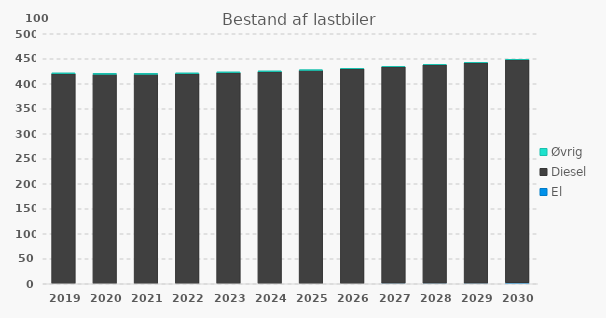
| Category | El | Diesel | Øvrig |
|---|---|---|---|
| 2019 | 0 | 420 | 2 |
| 2020 | 0 | 419 | 2 |
| 2021 | 0 | 419 | 2 |
| 2022 | 0 | 420 | 2 |
| 2023 | 0 | 422 | 2 |
| 2024 | 0 | 424 | 2 |
| 2025 | 0 | 427 | 1 |
| 2026 | 0 | 430 | 1 |
| 2027 | 1 | 433 | 1 |
| 2028 | 1 | 437 | 1 |
| 2029 | 1 | 441 | 1 |
| 2030 | 2 | 446 | 1 |